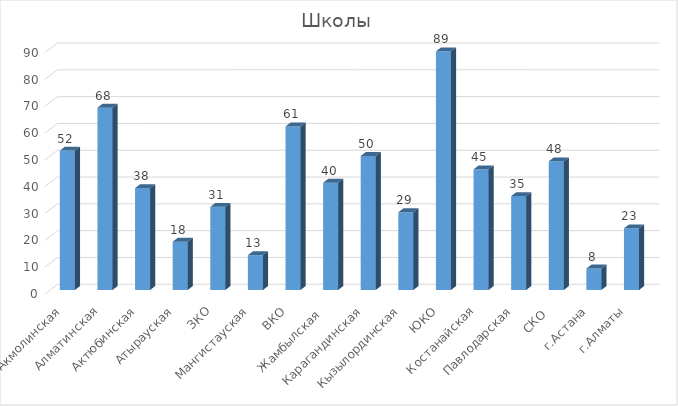
| Category | Series 0 |
|---|---|
| Акмолинская | 52 |
| Алматинская | 68 |
| Актюбинская | 38 |
| Атырауская | 18 |
| ЗКО | 31 |
| Мангистауская | 13 |
| ВКО | 61 |
| Жамбылская  | 40 |
| Карагандинская | 50 |
| Кызылординская | 29 |
| ЮКО | 89 |
| Костанайская | 45 |
| Павлодарская | 35 |
| СКО  | 48 |
| г.Астана | 8 |
| г.Алматы | 23 |